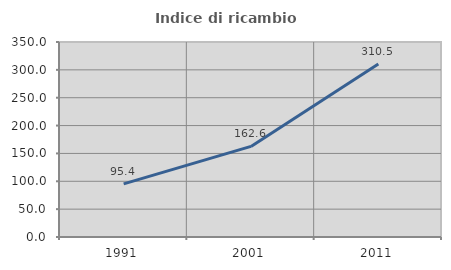
| Category | Indice di ricambio occupazionale  |
|---|---|
| 1991.0 | 95.413 |
| 2001.0 | 162.637 |
| 2011.0 | 310.526 |